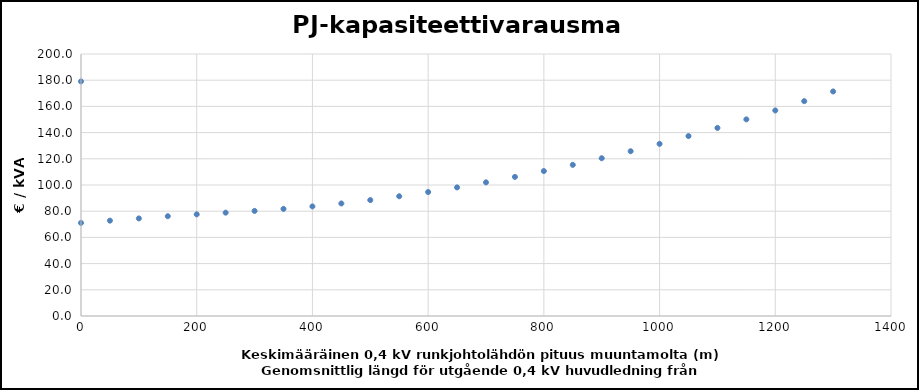
| Category | PJ kapasiteettivarausmaksu |
|---|---|
| 0.0 | 71.076 |
| 50.0 | 72.782 |
| 100.0 | 74.488 |
| 150.0 | 76.178 |
| 200.0 | 77.604 |
| 250.0 | 78.884 |
| 300.0 | 80.206 |
| 350.0 | 81.761 |
| 400.0 | 83.652 |
| 450.0 | 85.9 |
| 500.0 | 88.488 |
| 550.0 | 91.401 |
| 600.0 | 94.632 |
| 650.0 | 98.175 |
| 700.0 | 102.024 |
| 750.0 | 106.177 |
| 800.0 | 110.63 |
| 850.0 | 115.382 |
| 900.0 | 120.432 |
| 950.0 | 125.777 |
| 1000.0 | 131.417 |
| 1050.0 | 137.35 |
| 1100.0 | 143.577 |
| 1150.0 | 150.097 |
| 1200.0 | 156.909 |
| 1250.0 | 164.013 |
| 1300.0 | 171.408 |